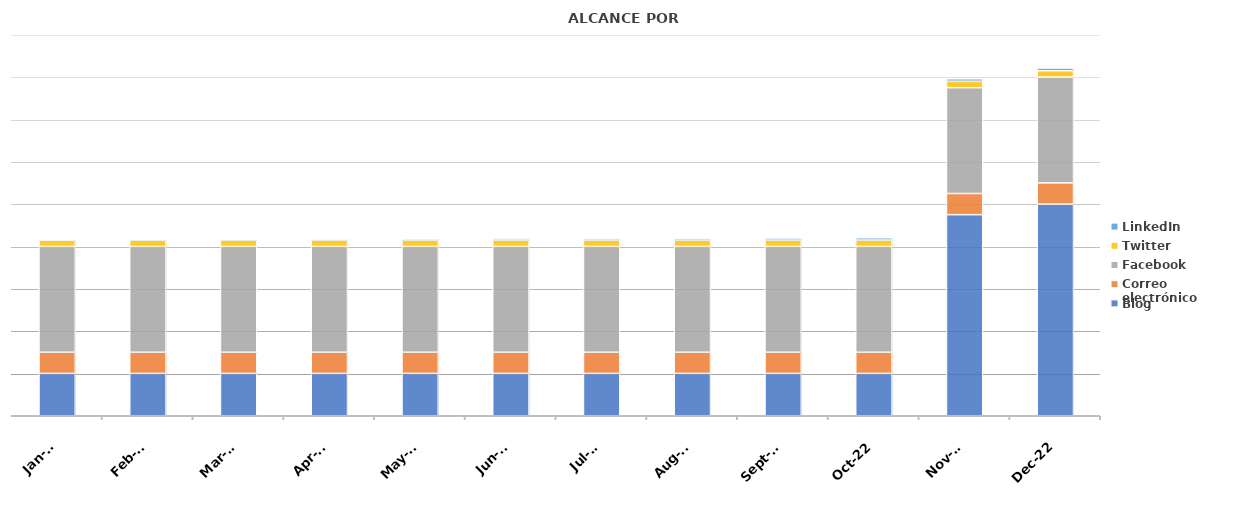
| Category | Blog | Correo electrónico | Facebook | Twitter | LinkedIn |
|---|---|---|---|---|---|
| 2022-01-18 | 200 | 100 | 500 | 30 | 2 |
| 2022-02-18 | 200 | 100 | 500 | 30 | 3 |
| 2022-03-18 | 200 | 100 | 500 | 30 | 4 |
| 2022-04-18 | 200 | 100 | 500 | 30 | 5 |
| 2022-05-18 | 200 | 100 | 500 | 30 | 6 |
| 2022-06-18 | 200 | 100 | 500 | 30 | 7 |
| 2022-07-18 | 200 | 100 | 500 | 30 | 8 |
| 2022-08-18 | 200 | 100 | 500 | 30 | 9 |
| 2022-09-18 | 200 | 100 | 500 | 30 | 10 |
| 2022-10-18 | 200 | 100 | 500 | 30 | 11 |
| 2022-11-18 | 950 | 100 | 500 | 30 | 12 |
| 2022-12-18 | 1000 | 100 | 500 | 30 | 13 |